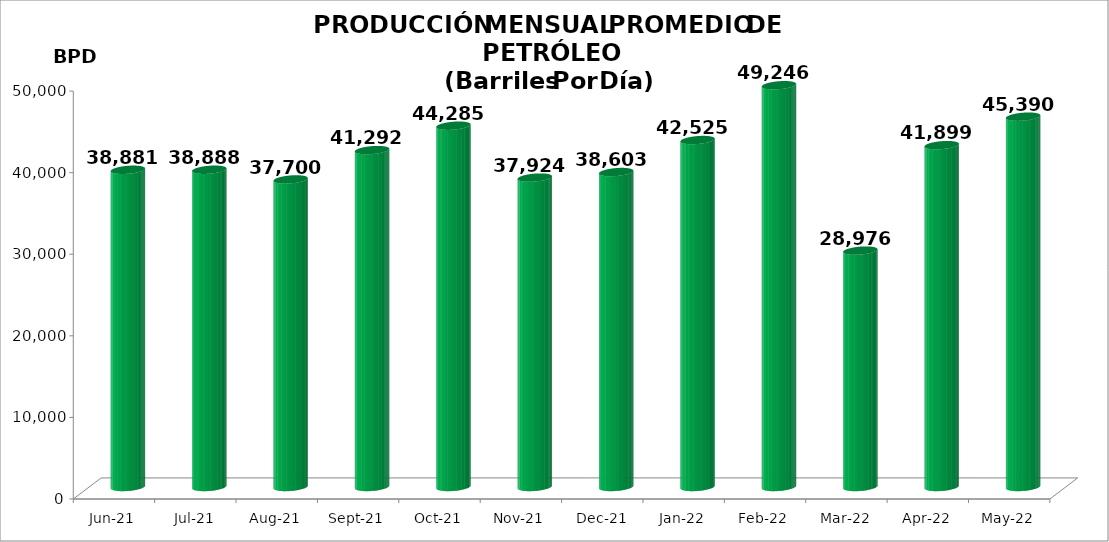
| Category | Series 0 |
|---|---|
| 2021-06-01 | 38881.4 |
| 2021-07-01 | 38887.645 |
| 2021-08-01 | 37699.645 |
| 2021-09-01 | 41292 |
| 2021-10-01 | 44285 |
| 2021-11-01 | 37924 |
| 2021-12-01 | 38603 |
| 2022-01-01 | 42524.516 |
| 2022-02-01 | 49246 |
| 2022-03-01 | 28976.419 |
| 2022-04-01 | 41899 |
| 2022-05-01 | 45390.387 |